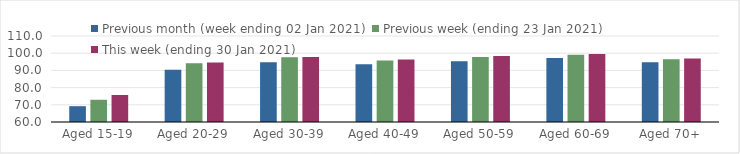
| Category | Previous month (week ending 02 Jan 2021) | Previous week (ending 23 Jan 2021) | This week (ending 30 Jan 2021) |
|---|---|---|---|
| Aged 15-19 | 69.19 | 72.92 | 75.69 |
| Aged 20-29 | 90.39 | 94.15 | 94.61 |
| Aged 30-39 | 94.7 | 97.64 | 97.86 |
| Aged 40-49 | 93.58 | 95.75 | 96.29 |
| Aged 50-59 | 95.33 | 97.83 | 98.35 |
| Aged 60-69 | 97.24 | 99.17 | 99.5 |
| Aged 70+ | 94.68 | 96.48 | 96.91 |